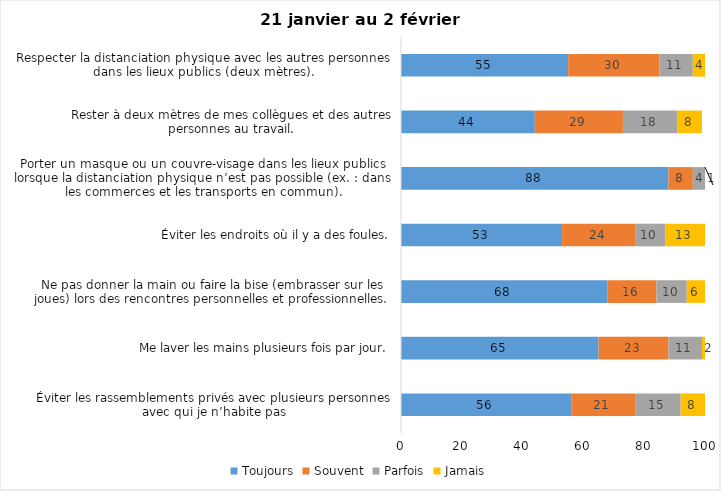
| Category | Toujours | Souvent | Parfois | Jamais |
|---|---|---|---|---|
| Éviter les rassemblements privés avec plusieurs personnes avec qui je n’habite pas | 56 | 21 | 15 | 8 |
| Me laver les mains plusieurs fois par jour. | 65 | 23 | 11 | 2 |
| Ne pas donner la main ou faire la bise (embrasser sur les joues) lors des rencontres personnelles et professionnelles. | 68 | 16 | 10 | 6 |
| Éviter les endroits où il y a des foules. | 53 | 24 | 10 | 13 |
| Porter un masque ou un couvre-visage dans les lieux publics lorsque la distanciation physique n’est pas possible (ex. : dans les commerces et les transports en commun). | 88 | 8 | 4 | 1 |
| Rester à deux mètres de mes collègues et des autres personnes au travail. | 44 | 29 | 18 | 8 |
| Respecter la distanciation physique avec les autres personnes dans les lieux publics (deux mètres). | 55 | 30 | 11 | 4 |